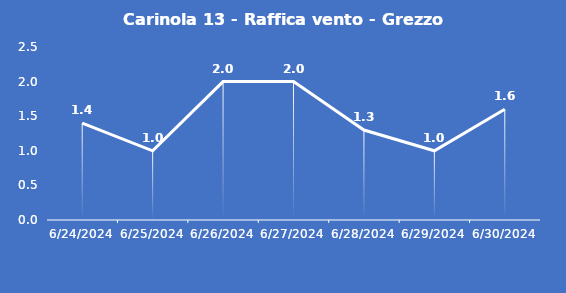
| Category | Carinola 13 - Raffica vento - Grezzo (m/s) |
|---|---|
| 6/24/24 | 1.4 |
| 6/25/24 | 1 |
| 6/26/24 | 2 |
| 6/27/24 | 2 |
| 6/28/24 | 1.3 |
| 6/29/24 | 1 |
| 6/30/24 | 1.6 |